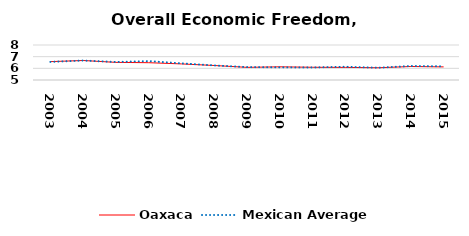
| Category | Oaxaca | Mexican Average  |
|---|---|---|
| 2003.0 | 6.574 | 6.552 |
| 2004.0 | 6.671 | 6.668 |
| 2005.0 | 6.51 | 6.546 |
| 2006.0 | 6.484 | 6.619 |
| 2007.0 | 6.378 | 6.428 |
| 2008.0 | 6.244 | 6.248 |
| 2009.0 | 6.084 | 6.106 |
| 2010.0 | 6.13 | 6.086 |
| 2011.0 | 6.091 | 6.074 |
| 2012.0 | 6.08 | 6.134 |
| 2013.0 | 6.05 | 6.054 |
| 2014.0 | 6.157 | 6.2 |
| 2015.0 | 6.125 | 6.174 |